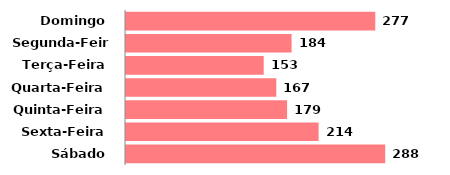
| Category | Qtde |
|---|---|
| Domingo | 277 |
| Segunda-Feira | 184 |
| Terça-Feira | 153 |
| Quarta-Feira | 167 |
| Quinta-Feira | 179 |
| Sexta-Feira | 214 |
| Sábado | 288 |